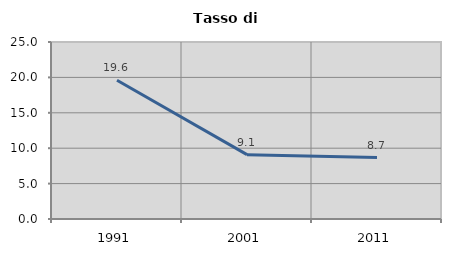
| Category | Tasso di disoccupazione   |
|---|---|
| 1991.0 | 19.592 |
| 2001.0 | 9.091 |
| 2011.0 | 8.671 |